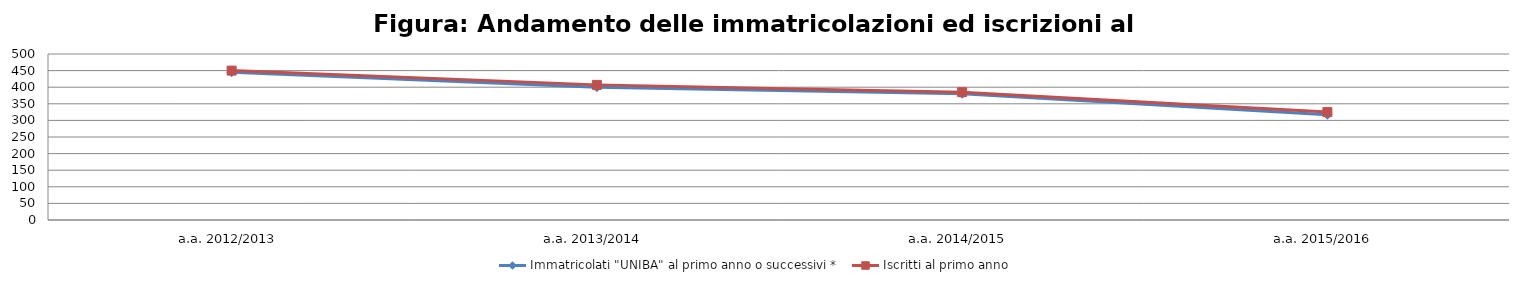
| Category | Immatricolati "UNIBA" al primo anno o successivi * | Iscritti al primo anno  |
|---|---|---|
| a.a. 2012/2013 | 445 | 450 |
| a.a. 2013/2014 | 400 | 407 |
| a.a. 2014/2015 | 380 | 385 |
| a.a. 2015/2016 | 317 | 325 |